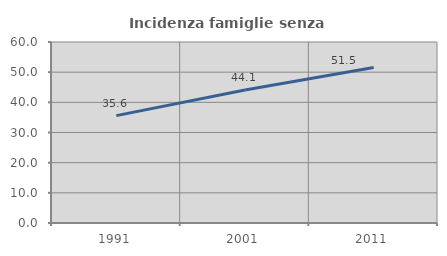
| Category | Incidenza famiglie senza nuclei |
|---|---|
| 1991.0 | 35.593 |
| 2001.0 | 44.068 |
| 2011.0 | 51.546 |